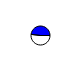
| Category | Series 0 |
|---|---|
| 0 | 3283846 |
| 1 | 3045967 |